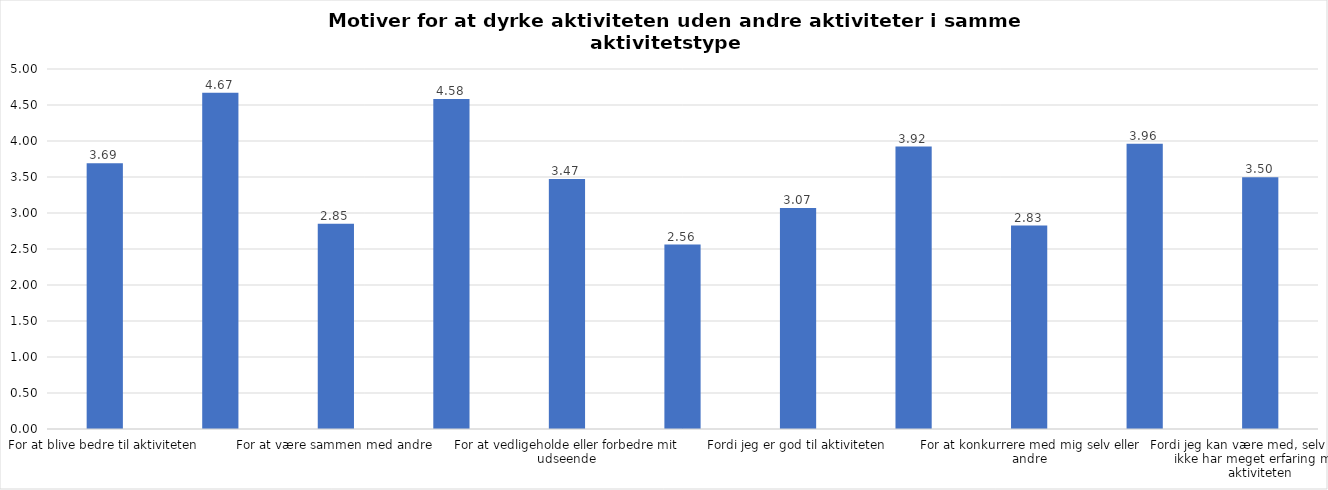
| Category | Gennemsnit |
|---|---|
| For at blive bedre til aktiviteten | 3.691 |
| For at vedligeholde eller forbedre min sundhed (fx helbred, fysisk form) | 4.672 |
| For at være sammen med andre | 2.85 |
| For at gøre noget godt for mig selv | 4.584 |
| For at vedligeholde eller forbedre mit udseende | 3.471 |
| Fordi andre i min omgangskreds opmuntrer mig til det | 2.562 |
| Fordi jeg er god til aktiviteten | 3.069 |
| Fordi jeg godt kan lide aktiviteten | 3.923 |
| For at konkurrere med mig selv eller andre | 2.826 |
| Fordi aktiviteten passer godt ind i min hverdag | 3.961 |
| Fordi jeg kan være med, selv om jeg ikke har meget erfaring med aktiviteten | 3.497 |